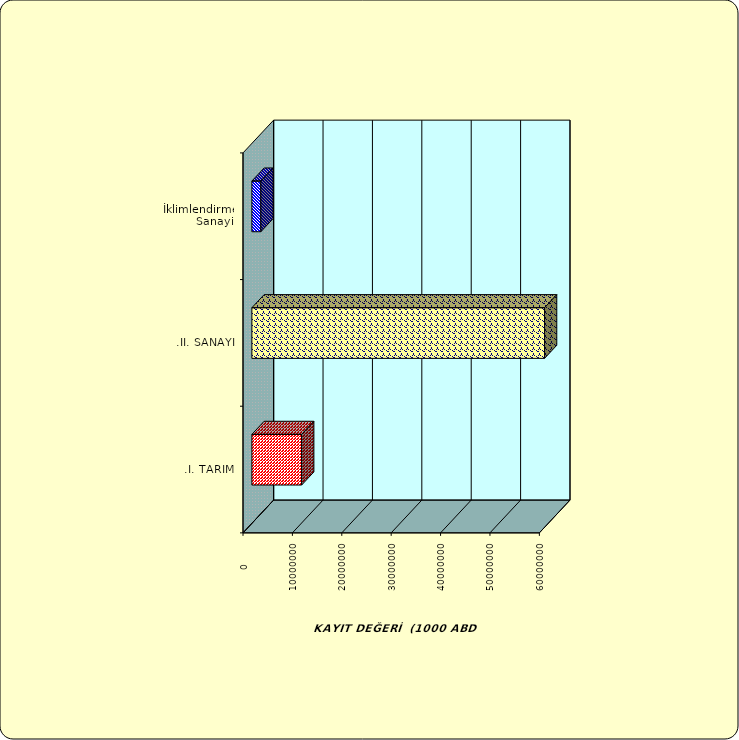
| Category | Series 0 |
|---|---|
| .I. TARIM | 10076818.035 |
| .II. SANAYİ | 59251758.557 |
|  İklimlendirme Sanayii | 1820421.978 |